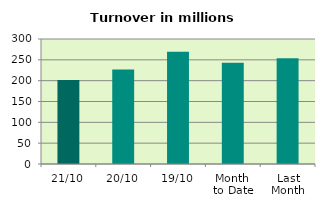
| Category | Series 0 |
|---|---|
| 21/10 | 201.519 |
| 20/10 | 226.805 |
| 19/10 | 269.323 |
| Month 
to Date | 242.87 |
| Last
Month | 253.961 |